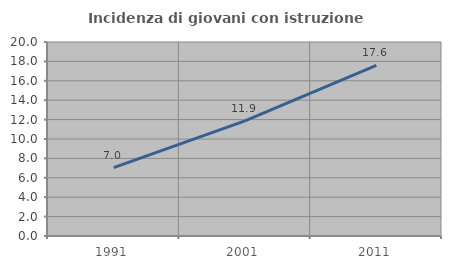
| Category | Incidenza di giovani con istruzione universitaria |
|---|---|
| 1991.0 | 7.048 |
| 2001.0 | 11.877 |
| 2011.0 | 17.581 |